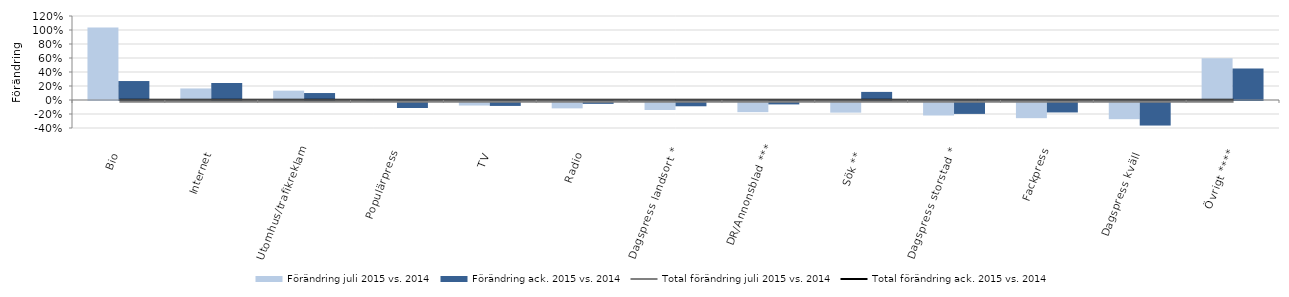
| Category | Förändring juli 2015 vs. 2014 | Förändring ack. 2015 vs. 2014 |
|---|---|---|
| Bio | 1.036 | 0.271 |
| Internet | 0.165 | 0.243 |
| Utomhus/trafikreklam | 0.134 | 0.1 |
| Populärpress | 0.011 | -0.1 |
| TV | -0.065 | -0.07 |
| Radio | -0.105 | -0.041 |
| Dagspress landsort * | -0.128 | -0.075 |
| DR/Annonsblad *** | -0.159 | -0.049 |
| Sök ** | -0.166 | 0.116 |
| Dagspress storstad * | -0.207 | -0.184 |
| Fackpress | -0.245 | -0.163 |
| Dagspress kväll  | -0.26 | -0.351 |
| Övrigt **** | 0.597 | 0.449 |